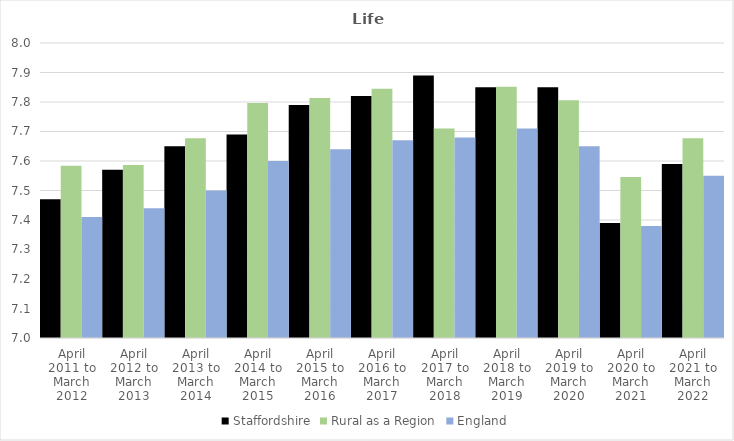
| Category | Staffordshire | Rural as a Region | England |
|---|---|---|---|
| April 2011 to March 2012 | 7.47 | 7.584 | 7.41 |
| April 2012 to March 2013 | 7.57 | 7.586 | 7.44 |
| April 2013 to March 2014 | 7.65 | 7.677 | 7.5 |
| April 2014 to March 2015 | 7.69 | 7.797 | 7.6 |
| April 2015 to March 2016 | 7.79 | 7.813 | 7.64 |
| April 2016 to March 2017 | 7.82 | 7.845 | 7.67 |
| April 2017 to March 2018 | 7.89 | 7.71 | 7.68 |
| April 2018 to March 2019 | 7.85 | 7.852 | 7.71 |
| April 2019 to March 2020 | 7.85 | 7.806 | 7.65 |
| April 2020 to March 2021 | 7.39 | 7.546 | 7.38 |
| April 2021 to March 2022 | 7.59 | 7.677 | 7.55 |